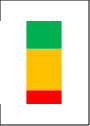
| Category | Series 0 | Series 1 | Series 2 |
|---|---|---|---|
| Summe11-16 | 0.1 | 0.3 | 0.2 |